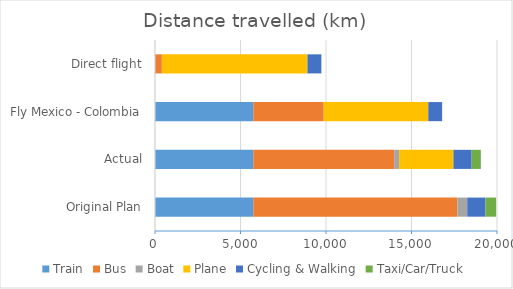
| Category | Train | Bus | Boat | Plane | Cycling & Walking | Taxi/Car/Truck |
|---|---|---|---|---|---|---|
| Original Plan | 5746 | 11940 | 574 | 0 | 1065 | 623 |
| Actual | 5746 | 8243 | 287 | 3176 | 1065 | 538 |
| Fly Mexico - Colombia | 5746 | 4119 | 0 | 6115 | 812 | 0 |
| Direct flight | 0 | 399.4 | 0 | 8518 | 812 | 0 |